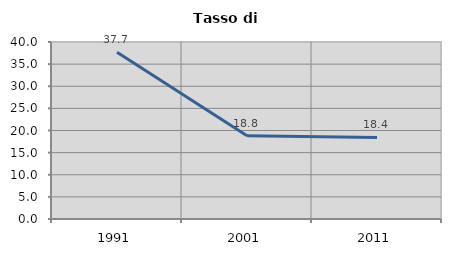
| Category | Tasso di disoccupazione   |
|---|---|
| 1991.0 | 37.662 |
| 2001.0 | 18.794 |
| 2011.0 | 18.43 |